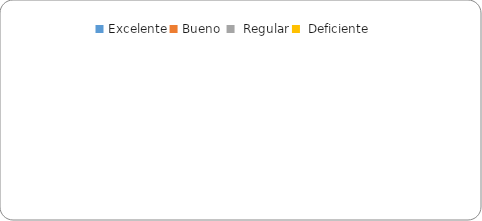
| Category | Series 0 |
|---|---|
| Excelente | 0 |
| Bueno  | 0 |
| Regular | 0 |
| Deficiente  | 0 |